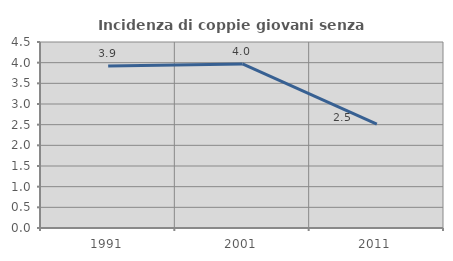
| Category | Incidenza di coppie giovani senza figli |
|---|---|
| 1991.0 | 3.922 |
| 2001.0 | 3.969 |
| 2011.0 | 2.515 |